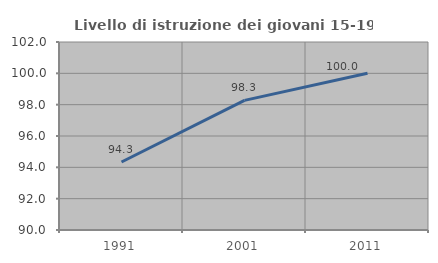
| Category | Livello di istruzione dei giovani 15-19 anni |
|---|---|
| 1991.0 | 94.34 |
| 2001.0 | 98.276 |
| 2011.0 | 100 |